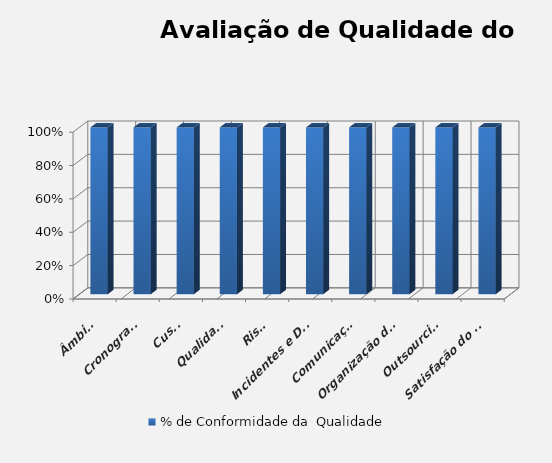
| Category | % de Conformidade da  Qualidade |
|---|---|
| Âmbito | 1 |
| Cronograma | 1 |
| Custo | 1 |
| Qualidade | 1 |
| Risco | 1 |
| Incidentes e Decisões | 1 |
| Comunicação | 1 |
| Organização do Projeto | 1 |
| Outsourcing | 1 |
| Satisfação do Cliente | 1 |